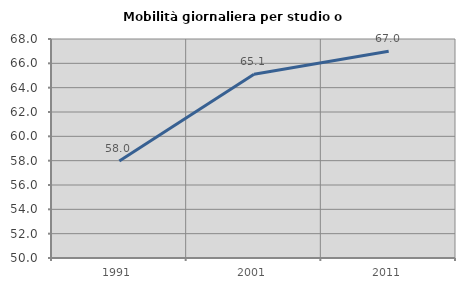
| Category | Mobilità giornaliera per studio o lavoro |
|---|---|
| 1991.0 | 57.974 |
| 2001.0 | 65.108 |
| 2011.0 | 66.99 |